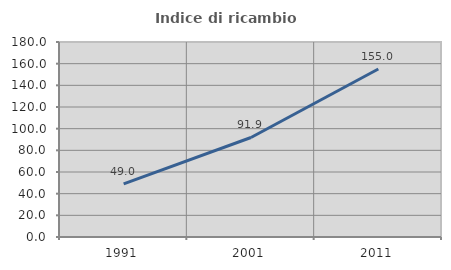
| Category | Indice di ricambio occupazionale  |
|---|---|
| 1991.0 | 49 |
| 2001.0 | 91.87 |
| 2011.0 | 155.039 |